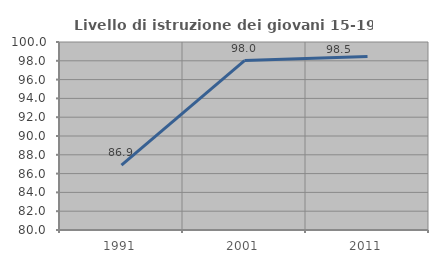
| Category | Livello di istruzione dei giovani 15-19 anni |
|---|---|
| 1991.0 | 86.911 |
| 2001.0 | 98.02 |
| 2011.0 | 98.462 |